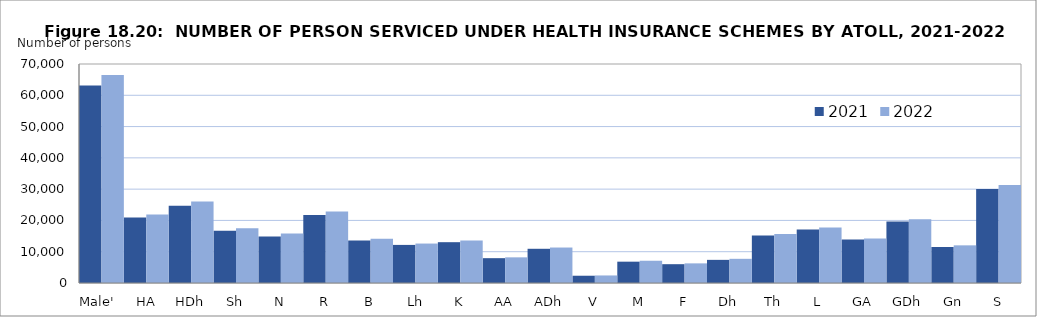
| Category | 2021  | 2022  |
|---|---|---|
| Male'  | 63123 | 66472 |
|  HA | 20941 | 21924 |
| HDh | 24690 | 26021 |
| Sh | 16661 | 17490 |
| N | 14862 | 15811 |
| R | 21734 | 22876 |
| B | 13613 | 14145 |
|  Lh | 12175 | 12609 |
| K | 13045 | 13563 |
| AA | 7938 | 8198 |
| ADh | 10937 | 11338 |
| V | 2323 | 2411 |
| M | 6817 | 7110 |
| F | 6013 | 6276 |
| Dh | 7396 | 7729 |
| Th | 15191 | 15697 |
| L | 17100 | 17720 |
| GA | 13916 | 14229 |
| GDh | 19686 | 20346 |
| Gn | 11500 | 12036 |
| S | 30066 | 31305 |